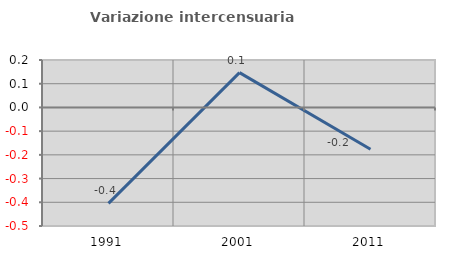
| Category | Variazione intercensuaria annua |
|---|---|
| 1991.0 | -0.404 |
| 2001.0 | 0.147 |
| 2011.0 | -0.176 |